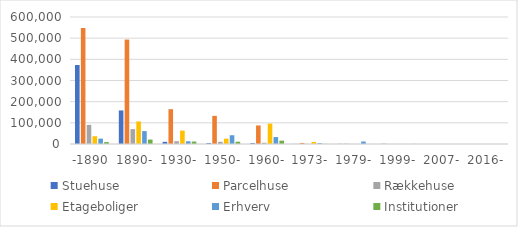
| Category | Stuehuse | Parcelhuse | Rækkehuse | Etageboliger | Erhverv | Institutioner |
|---|---|---|---|---|---|---|
| -1890 | 373136.593 | 548039.305 | 90463.093 | 36831.262 | 25334.871 | 9239.101 |
| 1890- | 158597.153 | 493452.3 | 70357.717 | 106641.641 | 60902.55 | 20935.786 |
| 1930- | 10323.674 | 164498.929 | 13190.123 | 63396.97 | 12930.522 | 11671.398 |
| 1950- | 4424.448 | 132928.959 | 10282.51 | 25219.099 | 41437.525 | 10776.312 |
| 1960- | 4284.996 | 87632.05 | 5767.383 | 96216.799 | 32736.117 | 15778.091 |
| 1973- | 399.562 | 5051.298 | 348.486 | 9637.619 | 4109.319 | 600.678 |
| 1979- | 799.637 | 1228.414 | 257.75 | 0 | 11798.698 | 135.492 |
| 1999- | 955.601 | 0 | 0 | 120.399 | 0 | 549.351 |
| 2007- | 0 | 0 | 0 | 0 | 0 | 138.997 |
| 2016- | 0 | 0 | 0 | 0 | 0 | 0 |